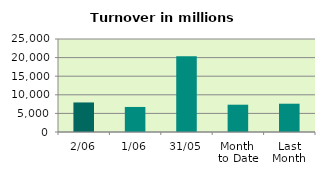
| Category | Series 0 |
|---|---|
| 2/06 | 7943.385 |
| 1/06 | 6731.637 |
| 31/05 | 20377.8 |
| Month 
to Date | 7337.511 |
| Last
Month | 7604.877 |